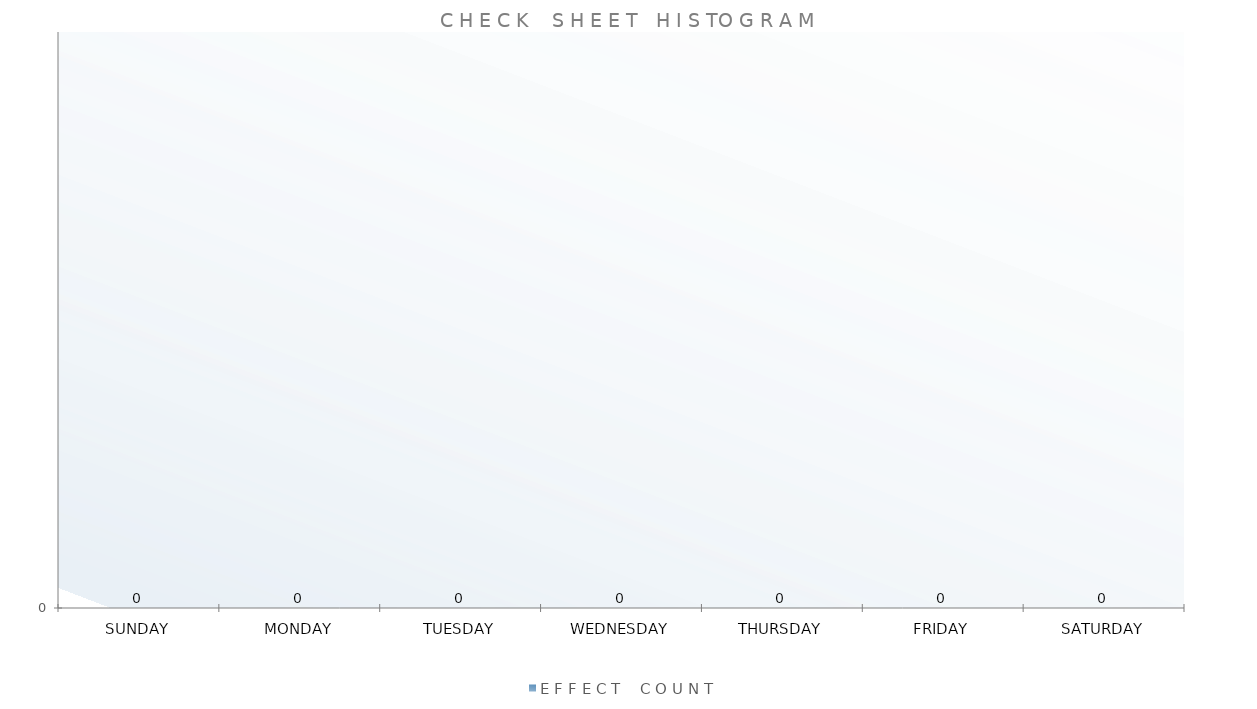
| Category | E F F E C T    C O U N T |
|---|---|
| SUNDAY | 0 |
| MONDAY | 0 |
| TUESDAY | 0 |
| WEDNESDAY | 0 |
| THURSDAY | 0 |
| FRIDAY | 0 |
| SATURDAY | 0 |